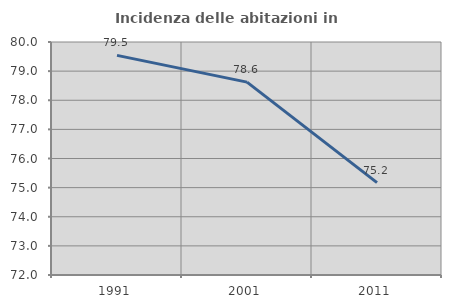
| Category | Incidenza delle abitazioni in proprietà  |
|---|---|
| 1991.0 | 79.54 |
| 2001.0 | 78.622 |
| 2011.0 | 75.173 |